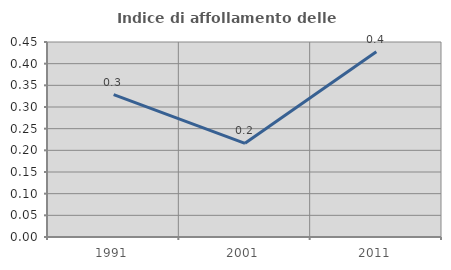
| Category | Indice di affollamento delle abitazioni  |
|---|---|
| 1991.0 | 0.329 |
| 2001.0 | 0.216 |
| 2011.0 | 0.428 |